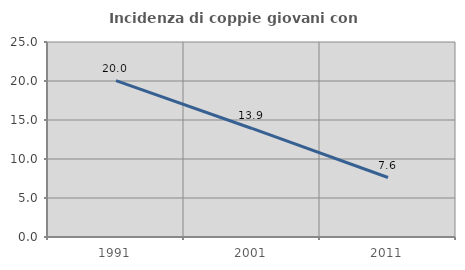
| Category | Incidenza di coppie giovani con figli |
|---|---|
| 1991.0 | 20.05 |
| 2001.0 | 13.915 |
| 2011.0 | 7.628 |